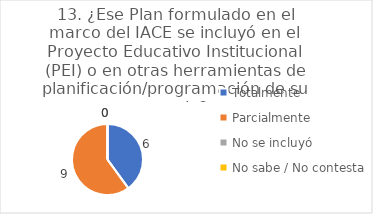
| Category | 13. ¿Ese Plan formulado en el marco del IACE se incluyó en el Proyecto Educativo Institucional (PEI) o en otras herramientas de planificación/programación de su escuela? |
|---|---|
| Totalmente  | 0.4 |
| Parcialmente  | 0.6 |
| No se incluyó  | 0 |
| No sabe / No contesta | 0 |